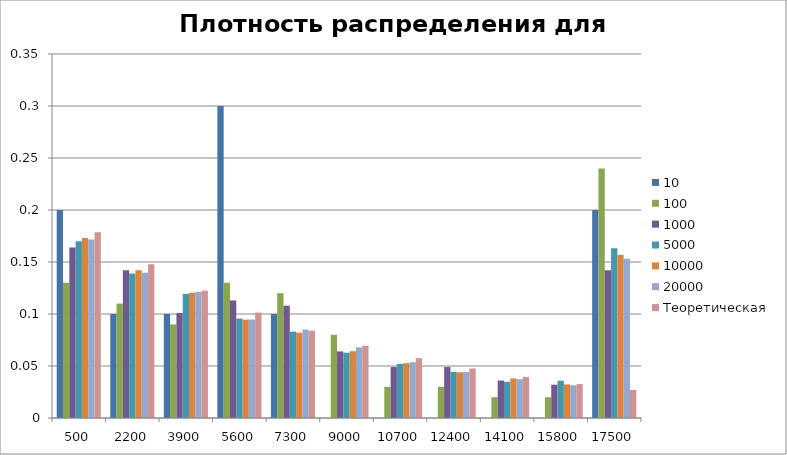
| Category | 10 | 100 | 1000 | 5000 | 10000 | 20000 | Теоретическая |
|---|---|---|---|---|---|---|---|
| 500.0 | 0.2 | 0.13 | 0.164 | 0.17 | 0.173 | 0.172 | 0.179 |
| 2200.0 | 0.1 | 0.11 | 0.142 | 0.139 | 0.142 | 0.14 | 0.148 |
| 3900.0 | 0.1 | 0.09 | 0.101 | 0.119 | 0.12 | 0.121 | 0.122 |
| 5600.0 | 0.3 | 0.13 | 0.113 | 0.096 | 0.094 | 0.095 | 0.101 |
| 7300.0 | 0.1 | 0.12 | 0.108 | 0.083 | 0.082 | 0.085 | 0.084 |
| 9000.0 | 0 | 0.08 | 0.064 | 0.063 | 0.064 | 0.068 | 0.069 |
| 10700.0 | 0 | 0.03 | 0.049 | 0.052 | 0.053 | 0.054 | 0.058 |
| 12400.0 | 0 | 0.03 | 0.049 | 0.044 | 0.044 | 0.044 | 0.048 |
| 14100.0 | 0 | 0.02 | 0.036 | 0.035 | 0.038 | 0.037 | 0.039 |
| 15800.0 | 0 | 0.02 | 0.032 | 0.036 | 0.032 | 0.031 | 0.033 |
| 17500.0 | 0.2 | 0.24 | 0.142 | 0.163 | 0.157 | 0.153 | 0.027 |